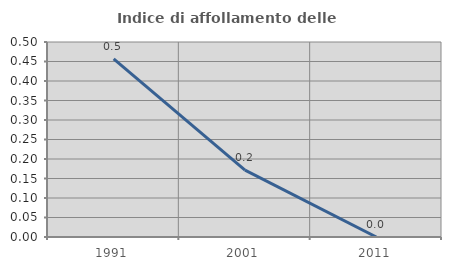
| Category | Indice di affollamento delle abitazioni  |
|---|---|
| 1991.0 | 0.457 |
| 2001.0 | 0.172 |
| 2011.0 | 0 |